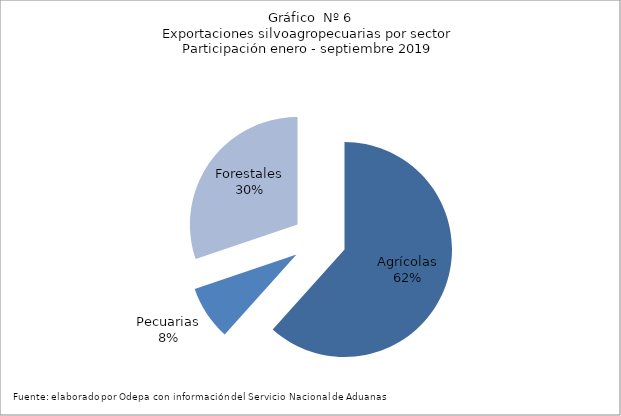
| Category | Series 0 |
|---|---|
| Agrícolas | 8113921 |
| Pecuarias | 1072449 |
| Forestales | 3977101 |